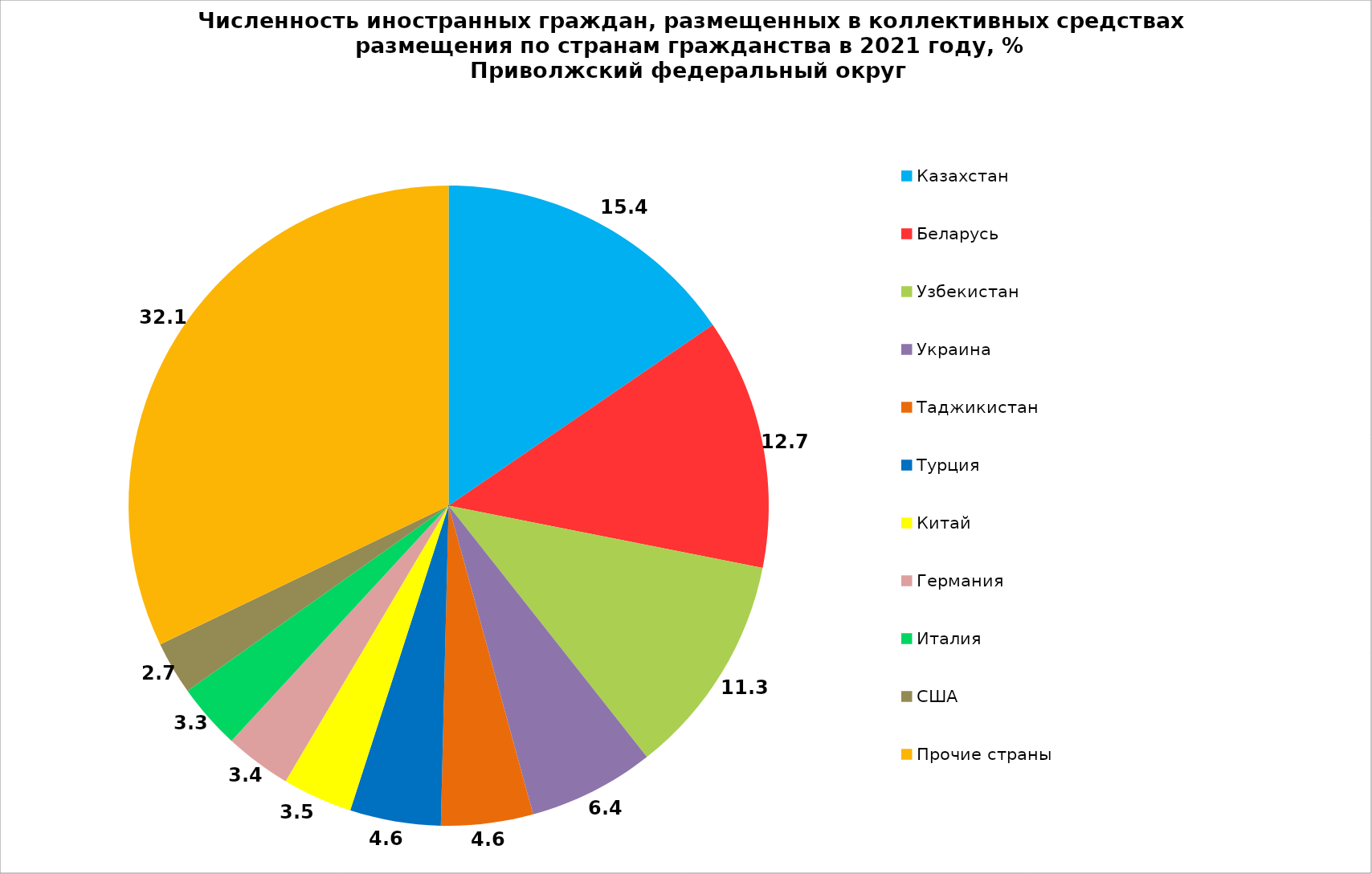
| Category | Series 0 |
|---|---|
| Казахстан | 15.449 |
| Беларусь | 12.662 |
| Узбекистан | 11.257 |
| Украина | 6.381 |
| Таджикистан | 4.639 |
| Турция | 4.584 |
| Китай | 3.533 |
| Германия | 3.361 |
| Италия | 3.315 |
| США | 2.688 |
| Прочие страны | 32.131 |